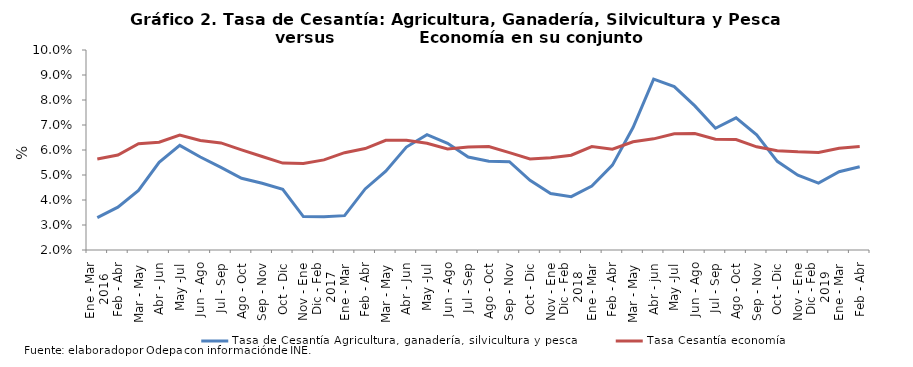
| Category | Tasa de Cesantía Agricultura, ganadería, silvicultura y pesca |
|---|---|
| 0 | 0.033 |
| 1 | 0.037 |
| 2 | 0.044 |
| 3 | 0.055 |
| 4 | 0.062 |
| 5 | 0.057 |
| 6 | 0.053 |
| 7 | 0.049 |
| 8 | 0.047 |
| 9 | 0.044 |
| 10 | 0.033 |
| 11 | 0.033 |
| 12 | 0.034 |
| 13 | 0.044 |
| 14 | 0.052 |
| 15 | 0.061 |
| 16 | 0.066 |
| 17 | 0.063 |
| 18 | 0.057 |
| 19 | 0.055 |
| 20 | 0.055 |
| 21 | 0.048 |
| 22 | 0.043 |
| 23 | 0.041 |
| 24 | 0.046 |
| 25 | 0.054 |
| 26 | 0.069 |
| 27 | 0.088 |
| 28 | 0.085 |
| 29 | 0.078 |
| 30 | 0.069 |
| 31 | 0.073 |
| 32 | 0.066 |
| 33 | 0.055 |
| 34 | 0.05 |
| 35 | 0.047 |
| 36 | 0.051 |
| 37 | 0.053 |